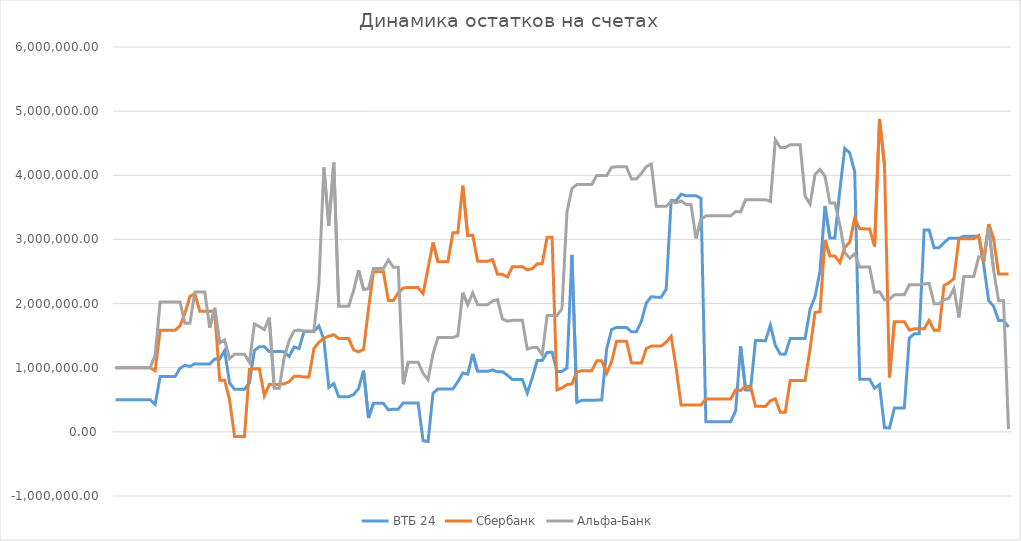
| Category | ВТБ 24 | Сбербанк | Альфа-Банк |
|---|---|---|---|
| 1/1/13 | 500000 | 1000000 | 1000000 |
| 1/2/13 | 500000 | 1000000 | 1000000 |
| 1/3/13 | 500000 | 1000000 | 1000000 |
| 1/4/13 | 500000 | 1000000 | 1000000 |
| 1/5/13 | 500000 | 1000000 | 1000000 |
| 1/6/13 | 500000 | 1000000 | 1000000 |
| 1/7/13 | 500000 | 1000000 | 1000000 |
| 1/8/13 | 500000 | 1000000 | 1000000 |
| 1/9/13 | 425994.13 | 954415.91 | 1200000 |
| 1/10/13 | 861466.35 | 1582142.11 | 2026000 |
| 1/11/13 | 861466.35 | 1582142.11 | 2026000 |
| 1/12/13 | 861466.35 | 1582142.11 | 2026000 |
| 1/13/13 | 861466.35 | 1582142.11 | 2026000 |
| 1/14/13 | 991315.32 | 1652647.11 | 2024799.05 |
| 1/15/13 | 1037845.36 | 1848357.36 | 1691400.1 |
| 1/16/13 | 1019266.36 | 2111202.36 | 1691400.1 |
| 1/17/13 | 1061428.17 | 2152306.69 | 2181158.05 |
| 1/18/13 | 1056463.73 | 1879461.69 | 2181158.05 |
| 1/19/13 | 1056463.73 | 1879461.69 | 2181158.05 |
| 1/20/13 | 1056463.73 | 1879461.69 | 1620721.05 |
| 1/21/13 | 1135584.67 | 1879461.69 | 1933566.05 |
| 1/22/13 | 1133849.46 | 805556.3 | 1384048.61 |
| 1/23/13 | 1267661.46 | 805556.3 | 1433750.21 |
| 1/24/13 | 761541.37 | 498769.31 | 1141591.9 |
| 1/25/13 | 662959.18 | -70792.69 | 1209638.92 |
| 1/26/13 | 662959.18 | -70792.69 | 1209638.92 |
| 1/27/13 | 662959.18 | -70792.69 | 1209638.92 |
| 1/28/13 | 764119.4 | 972870.31 | 1082975.73 |
| 1/29/13 | 1268314.35 | 983471.01 | 1683285.98 |
| 1/30/13 | 1328330.5 | 983471.01 | 1642460.64 |
| 1/31/13 | 1328330.5 | 563582.62 | 1594558.54 |
| 2/1/13 | 1253680.8 | 739783.13 | 1780884.43 |
| 2/2/13 | 1253680.8 | 739783.13 | 680884.43 |
| 2/3/13 | 1253680.8 | 739783.13 | 680884.43 |
| 2/4/13 | 1247485.8 | 749083.13 | 1159897.36 |
| 2/5/13 | 1175784.99 | 780521.15 | 1424866.36 |
| 2/6/13 | 1323192.91 | 867247.1 | 1574010.99 |
| 2/7/13 | 1298296.34 | 867247.1 | 1588010.99 |
| 2/8/13 | 1563738.9 | 855968.97 | 1572394.58 |
| 2/9/13 | 1563738.9 | 855968.97 | 1572394.58 |
| 2/10/13 | 1563738.9 | 1300968.97 | 1572394.58 |
| 2/11/13 | 1650114.9 | 1395085.77 | 2302094.19 |
| 2/12/13 | 1444587.69 | 1460893.28 | 4122769.95 |
| 2/13/13 | 692820.79 | 1491743.94 | 3214061.77 |
| 2/14/13 | 753625.79 | 1513883.51 | 4196761.77 |
| 2/15/13 | 546775.79 | 1454161.9 | 1957980.52 |
| 2/16/13 | 546775.79 | 1454161.9 | 1957980.52 |
| 2/17/13 | 546775.79 | 1454161.9 | 1957980.52 |
| 2/18/13 | 580787.01 | 1278252.98 | 2204794.01 |
| 2/19/13 | 674909.9 | 1247182.72 | 2520735.31 |
| 2/20/13 | 953427.46 | 1283809.92 | 2219982.11 |
| 2/21/13 | 216337.54 | 1917932.81 | 2233204.01 |
| 2/22/13 | 444647.99 | 2497713.6 | 2547589.91 |
| 2/23/13 | 444647.99 | 2497713.6 | 2547589.91 |
| 2/24/13 | 444647.99 | 2497713.6 | 2547589.91 |
| 2/25/13 | 342541.64 | 2047805.6 | 2683110.66 |
| 2/26/13 | 353533.34 | 2047805.6 | 2565225.66 |
| 2/27/13 | 353533.34 | 2167315.6 | 2565225.66 |
| 2/28/13 | 451701.22 | 2242501.81 | 742906.09 |
| 3/1/13 | 451701.22 | 2251395.21 | 1084935.69 |
| 3/2/13 | 451701.22 | 2251395.21 | 1084935.69 |
| 3/3/13 | 451701.22 | 2248795.21 | 1084935.69 |
| 3/4/13 | -137186.85 | 2154441.92 | 911973.59 |
| 3/5/13 | -152250.98 | 2549705.98 | 813988.64 |
| 3/6/13 | 601653.38 | 2952143.14 | 1218096.76 |
| 3/7/13 | 668535.78 | 2652299.94 | 1469713.96 |
| 3/8/13 | 668535.78 | 2652299.94 | 1469713.96 |
| 3/9/13 | 668535.78 | 2652299.94 | 1469713.96 |
| 3/10/13 | 668535.78 | 3102299.94 | 1469713.96 |
| 3/11/13 | 780780.01 | 3102299.94 | 1499213.96 |
| 3/12/13 | 917499.53 | 3837407.9 | 2169778.4 |
| 3/13/13 | 899819.19 | 3058445.3 | 1980164.22 |
| 3/14/13 | 1215286.06 | 3066590.63 | 2166025.1 |
| 3/15/13 | 943609.54 | 2660063.24 | 1982208.28 |
| 3/16/13 | 943609.54 | 2660063.24 | 1982208.28 |
| 3/17/13 | 943609.54 | 2660063.24 | 1982208.28 |
| 3/18/13 | 964849.54 | 2685525.28 | 2040370.28 |
| 3/19/13 | 936892.6 | 2455864.77 | 2062618 |
| 3/20/13 | 936892.6 | 2455864.77 | 1758815.04 |
| 3/21/13 | 883114.6 | 2413728.91 | 1725416.23 |
| 3/22/13 | 816109.26 | 2574362.36 | 1740383.09 |
| 3/23/13 | 816109.26 | 2574362.36 | 1740383.09 |
| 3/24/13 | 816109.26 | 2574362.36 | 1740383.09 |
| 3/25/13 | 605371.6 | 2526829.91 | 1288656.09 |
| 3/26/13 | 839371.5 | 2544131.66 | 1314144.09 |
| 3/27/13 | 1111565.64 | 2619356.66 | 1314144.09 |
| 3/28/13 | 1111565.64 | 2619356.66 | 1199326.09 |
| 3/29/13 | 1237471.64 | 3033259.36 | 1813958.82 |
| 3/30/13 | 1241671.64 | 3033259.36 | 1813958.82 |
| 3/31/13 | 942846.1 | 653699.36 | 1813958.82 |
| 4/1/13 | 942846.1 | 684391.16 | 1922990.82 |
| 4/2/13 | 993516.1 | 737491.16 | 3428183.31 |
| 4/3/13 | 2759083.89 | 746384.56 | 3795231.81 |
| 4/4/13 | 459083.89 | 934594.6 | 3855411.89 |
| 4/5/13 | 491878.46 | 952914.1 | 3855411.89 |
| 4/6/13 | 491878.46 | 952914.1 | 3855411.89 |
| 4/7/13 | 491878.46 | 952914.1 | 3855411.89 |
| 4/8/13 | 495375.46 | 1108084.1 | 3995305.61 |
| 4/9/13 | 495375.46 | 1108084.1 | 3995305.61 |
| 4/10/13 | 1291819.26 | 912240.5 | 3995305.61 |
| 4/11/13 | 1594548.26 | 1095329.3 | 4124237.43 |
| 4/12/13 | 1628532.26 | 1414365.9 | 4132125.59 |
| 4/13/13 | 1628532.26 | 1414365.9 | 4132125.59 |
| 4/14/13 | 1628532.26 | 1414365.9 | 4132125.59 |
| 4/15/13 | 1559762.26 | 1076340.9 | 3943344.34 |
| 4/16/13 | 1559762.26 | 1072110.6 | 3943344.34 |
| 4/17/13 | 1722586.59 | 1072110.6 | 4030761.53 |
| 4/18/13 | 2012039.79 | 1300018.6 | 4135761.53 |
| 4/19/13 | 2107403.97 | 1337416.34 | 4174686.96 |
| 4/20/13 | 2099003.97 | 1337416.34 | 3516367.96 |
| 4/21/13 | 2099003.97 | 1337416.34 | 3516367.96 |
| 4/22/13 | 2224011.28 | 1398530.06 | 3516367.96 |
| 4/23/13 | 3607188.49 | 1490212.02 | 3595512.07 |
| 4/24/13 | 3602201.01 | 1000704.82 | 3569921.09 |
| 4/25/13 | 3704634.05 | 417147.06 | 3597264.09 |
| 4/26/13 | 3680625.51 | 417147.06 | 3545824.93 |
| 4/27/13 | 3680625.51 | 417147.06 | 3545824.93 |
| 4/28/13 | 3680625.51 | 417147.06 | 3015824.93 |
| 4/29/13 | 3641364.19 | 417147.06 | 3308936.93 |
| 4/30/13 | 157687.19 | 512847.06 | 3367683.62 |
| 5/1/13 | 157687.19 | 512847.06 | 3367683.62 |
| 5/2/13 | 157687.19 | 512847.06 | 3367683.62 |
| 5/3/13 | 157687.19 | 512847.06 | 3367683.62 |
| 5/4/13 | 157687.19 | 512847.06 | 3367683.62 |
| 5/5/13 | 157687.19 | 512847.06 | 3367683.62 |
| 5/6/13 | 328605.48 | 655303.74 | 3434405.52 |
| 5/7/13 | 1334121.03 | 645345.59 | 3429190.69 |
| 5/8/13 | 652838.54 | 709075.3 | 3619689.73 |
| 5/9/13 | 652838.54 | 709075.3 | 3619689.73 |
| 5/10/13 | 1422838.54 | 399075.3 | 3619689.73 |
| 5/11/13 | 1422838.54 | 399075.3 | 3619689.73 |
| 5/12/13 | 1418301.02 | 394861.89 | 3619689.73 |
| 5/13/13 | 1663656.97 | 484289.88 | 3593035.35 |
| 5/14/13 | 1345545.86 | 515285.36 | 4553891.35 |
| 5/15/13 | 1211727.86 | 304460.86 | 4431542.54 |
| 5/16/13 | 1209761.47 | 304460.86 | 4431542.54 |
| 5/17/13 | 1454535.83 | 800569.74 | 4476974.94 |
| 5/18/13 | 1454535.83 | 800569.74 | 4476974.94 |
| 5/19/13 | 1454535.83 | 800569.74 | 4476974.94 |
| 5/20/13 | 1454535.83 | 800569.74 | 3673440.73 |
| 5/21/13 | 1913758.31 | 1290522.26 | 3550216.5 |
| 5/22/13 | 2105608.24 | 1861178.07 | 4011562.98 |
| 5/23/13 | 2504098.9 | 1873138.04 | 4090074.22 |
| 5/24/13 | 3520691.38 | 2988632.34 | 3988402.68 |
| 5/25/13 | 3023865.38 | 2743437.34 | 3568297.43 |
| 5/26/13 | 3023865.38 | 2743437.34 | 3568297.43 |
| 5/27/13 | 3767875.95 | 2638642.79 | 3228509.49 |
| 5/28/13 | 4421186.85 | 2874099.99 | 2797150.29 |
| 5/29/13 | 4346556.76 | 2957977.55 | 2706843.57 |
| 5/30/13 | 4051935.77 | 3337173.77 | 2777052.96 |
| 5/31/13 | 820885.45 | 3165063.27 | 2568569.47 |
| 6/1/13 | 820885.45 | 3165063.27 | 2568569.47 |
| 6/2/13 | 820885.45 | 3162850.95 | 2568569.47 |
| 6/3/13 | 679293.98 | 2889368.83 | 2176105.35 |
| 6/4/13 | 736435.48 | 4876717.6 | 2184778.35 |
| 6/5/13 | 64471.44 | 4156395.33 | 2059848.42 |
| 6/6/13 | 60471.44 | 849337.32 | 2068698.42 |
| 6/7/13 | 371614.09 | 1717262.72 | 2136873.39 |
| 6/8/13 | 371614.09 | 1717262.72 | 2136873.39 |
| 6/9/13 | 371614.09 | 1717262.72 | 2136873.39 |
| 6/10/13 | 1461656.45 | 1586150.4 | 2294143.79 |
| 6/11/13 | 1528149.46 | 1606433.03 | 2294143.79 |
| 6/12/13 | 1528149.46 | 1606433.03 | 2294143.79 |
| 6/13/13 | 3145321.01 | 1606433.03 | 2304763.79 |
| 6/14/13 | 3145321.01 | 1737408.03 | 2314817.39 |
| 6/15/13 | 2871364.76 | 1582283.03 | 1999122.39 |
| 6/16/13 | 2871364.76 | 1582283.03 | 1999122.39 |
| 6/17/13 | 2948759.24 | 2281842.39 | 2058238.18 |
| 6/18/13 | 3016991.48 | 2325964.39 | 2083249.12 |
| 6/19/13 | 3016991.48 | 2387950.8 | 2234975.02 |
| 6/20/13 | 3016991.48 | 3011709.97 | 1784827.06 |
| 6/21/13 | 3051012.83 | 3011709.97 | 2422494.48 |
| 6/22/13 | 3051012.83 | 3011709.97 | 2422494.48 |
| 6/23/13 | 3051012.83 | 3011709.97 | 2422494.48 |
| 6/24/13 | 3051012.83 | 3059204.97 | 2728767.03 |
| 6/25/13 | 2603151.77 | 2652419.88 | 2726378.52 |
| 6/26/13 | 2048005.92 | 3239010.13 | 3187037.98 |
| 6/27/13 | 1956574.87 | 3001055.74 | 2521046.92 |
| 6/28/13 | 1736034.5 | 2462499.79 | 2043490.29 |
| 6/29/13 | 1736034.5 | 2462499.79 | 2043490.29 |
| 6/30/13 | 1634797.25 | 2462499.79 | 43490.29 |